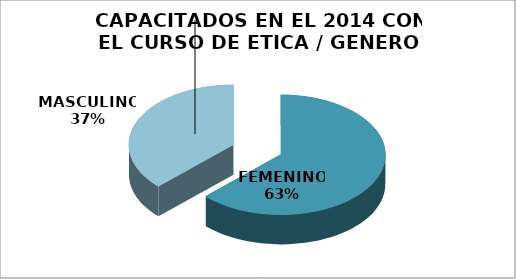
| Category | Series 0 |
|---|---|
| FEMENINO  | 69 |
| MASCULINO  | 41 |